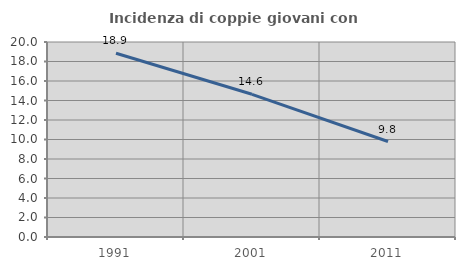
| Category | Incidenza di coppie giovani con figli |
|---|---|
| 1991.0 | 18.851 |
| 2001.0 | 14.636 |
| 2011.0 | 9.792 |